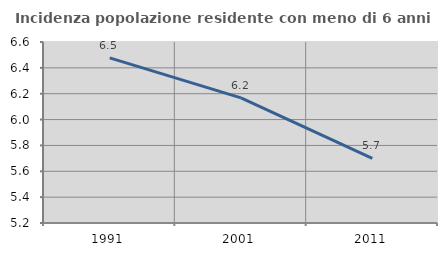
| Category | Incidenza popolazione residente con meno di 6 anni |
|---|---|
| 1991.0 | 6.477 |
| 2001.0 | 6.168 |
| 2011.0 | 5.7 |